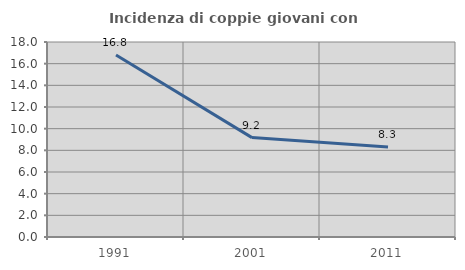
| Category | Incidenza di coppie giovani con figli |
|---|---|
| 1991.0 | 16.807 |
| 2001.0 | 9.174 |
| 2011.0 | 8.308 |